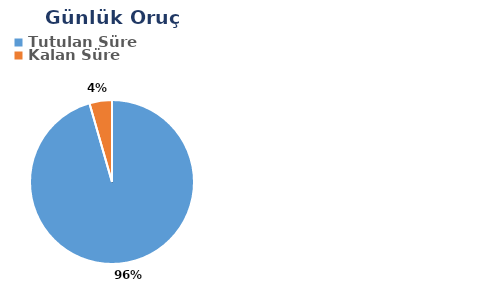
| Category | Günlük |
|---|---|
| Tutulan Süre | 0.568 |
| Kalan Süre | 0.026 |